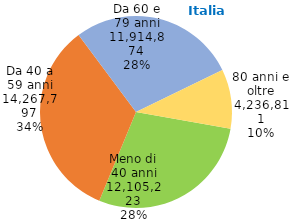
| Category | Series 0 |
|---|---|
| Meno di 40 anni | 12105223 |
| Da 40 a 59 anni | 14267797 |
| Da 60 e 79 anni | 11914874 |
| 80 anni e oltre | 4236811 |